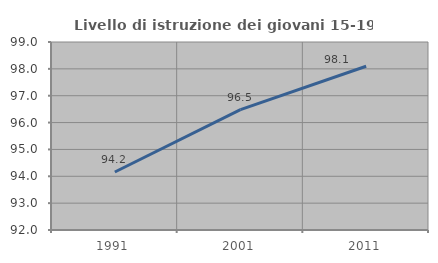
| Category | Livello di istruzione dei giovani 15-19 anni |
|---|---|
| 1991.0 | 94.161 |
| 2001.0 | 96.48 |
| 2011.0 | 98.096 |